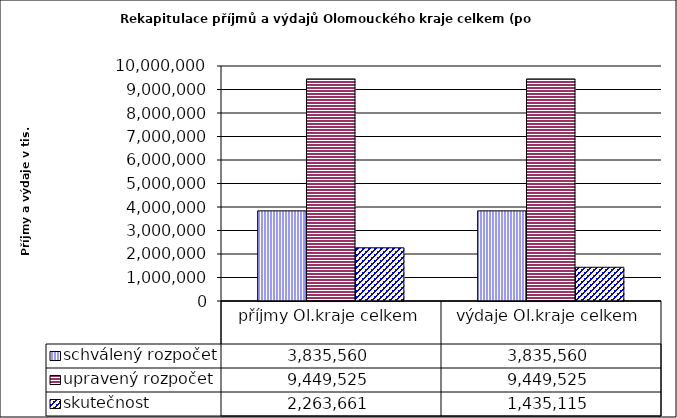
| Category | schválený rozpočet | upravený rozpočet | skutečnost |
|---|---|---|---|
| příjmy Ol.kraje celkem | 3835560 | 9449525 | 2263661 |
| výdaje Ol.kraje celkem | 3835560 | 9449525 | 1435115 |